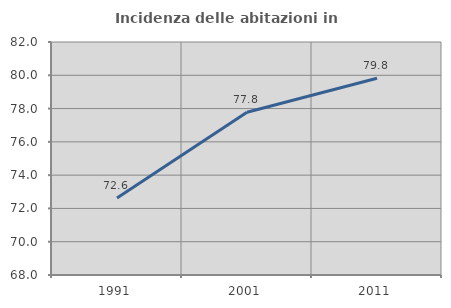
| Category | Incidenza delle abitazioni in proprietà  |
|---|---|
| 1991.0 | 72.624 |
| 2001.0 | 77.778 |
| 2011.0 | 79.823 |